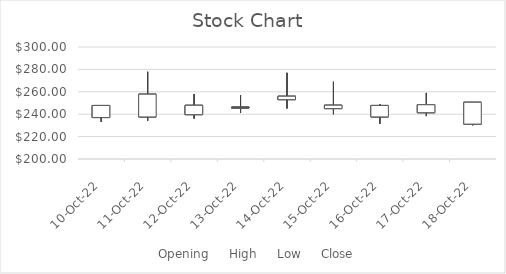
| Category | Opening | High | Low | Close |
|---|---|---|---|---|
| 2022-10-10 | 237 | 247.85 | 233.05 | 247.8 |
| 2022-10-11 | 237.56 | 277.86 | 234.02 | 257.86 |
| 2022-10-12 | 239.6 | 258.05 | 236.04 | 247.96 |
| 2022-10-13 | 246.4 | 257.05 | 241.05 | 246.2 |
| 2022-10-14 | 253 | 276.94 | 245.08 | 256.05 |
| 2022-10-15 | 245 | 268.96 | 239.98 | 248.03 |
| 2022-10-16 | 237.58 | 249.02 | 231.45 | 247.82 |
| 2022-10-17 | 241.35 | 259.02 | 238.32 | 248.45 |
| 2022-10-18 | 231.17 | 238.3 | 230.06 | 250.66 |